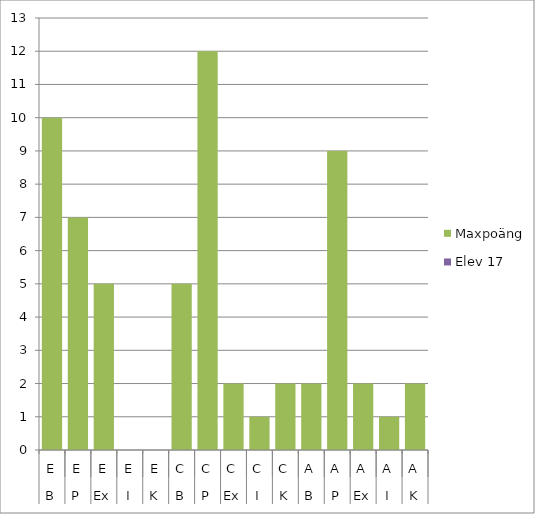
| Category | Maxpoäng | Elev 17 |
|---|---|---|
| 0 | 10 | 0 |
| 1 | 7 | 0 |
| 2 | 5 | 0 |
| 3 | 0 | 0 |
| 4 | 0 | 0 |
| 5 | 5 | 0 |
| 6 | 12 | 0 |
| 7 | 2 | 0 |
| 8 | 1 | 0 |
| 9 | 2 | 0 |
| 10 | 2 | 0 |
| 11 | 9 | 0 |
| 12 | 2 | 0 |
| 13 | 1 | 0 |
| 14 | 2 | 0 |